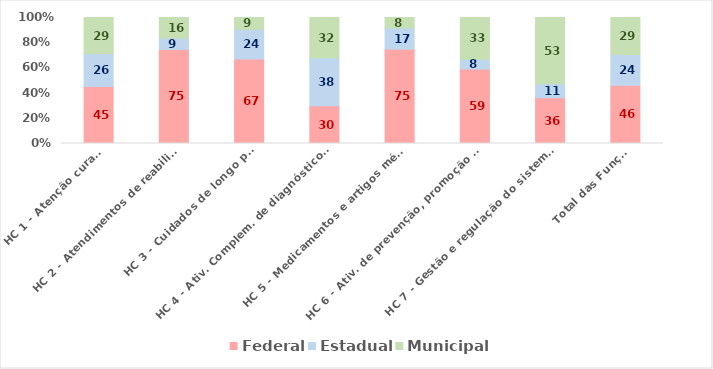
| Category | Federal | Estadual | Municipal |
|---|---|---|---|
| HC 1 - Atenção curativa | 45.295 | 26.042 | 28.663 |
| HC 2 - Atendimentos de reabilitação | 74.643 | 8.985 | 16.372 |
| HC 3 - Cuidados de longo prazo | 67.08 | 23.504 | 9.415 |
| HC 4 - Ativ. Complem. de diagnóstico e tratamento | 30.025 | 38.123 | 31.851 |
| HC 5 - Medicamentos e artigos médicos | 74.838 | 16.941 | 8.222 |
| HC 6 - Ativ. de prevenção, promoção e vigilância em saúde | 59.074 | 7.826 | 33.1 |
| HC 7 - Gestão e regulação do sistema de saúde | 36.297 | 11.041 | 52.662 |
| Total das Funções | 46.2 | 24.372 | 29.428 |